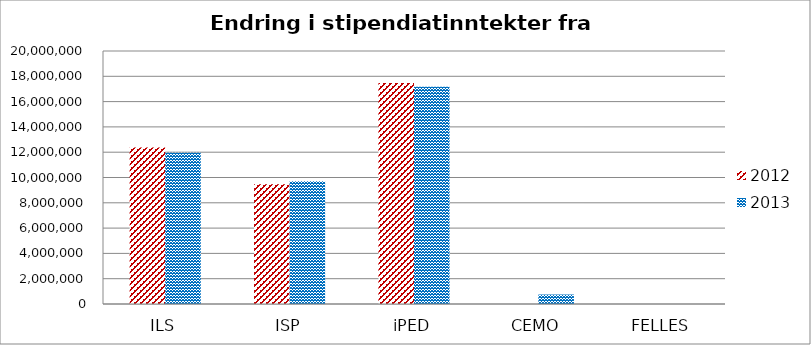
| Category | 2012 | 2013 |
|---|---|---|
| ILS | 12376000 | 11952000 |
| ISP | 9464000 | 9711000 |
| iPED | 17472000 | 17181000 |
| CEMO | 0 | 747000 |
| FELLES | 0 | 0 |